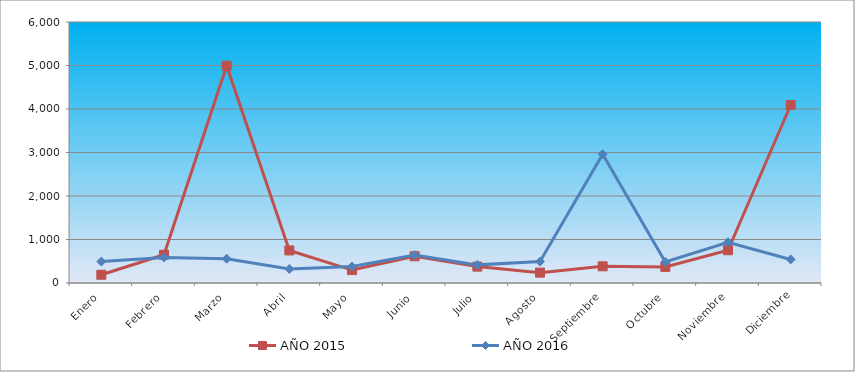
| Category | AÑO 2015 | AÑO 2016 |
|---|---|---|
| Enero | 190.077 | 493.134 |
| Febrero | 649.718 | 586.899 |
| Marzo | 4994.491 | 559.116 |
| Abril | 748.213 | 322.968 |
| Mayo | 297.212 | 378.532 |
| Junio | 615.159 | 642.463 |
| Julio | 376.698 | 416.733 |
| Agosto | 238.46 | 493.134 |
| Septiembre | 383.61 | 2962.131 |
| Octubre | 369.786 | 482.715 |
| Noviembre | 753.397 | 937.649 |
| Diciembre | 4091.326 | 541.753 |